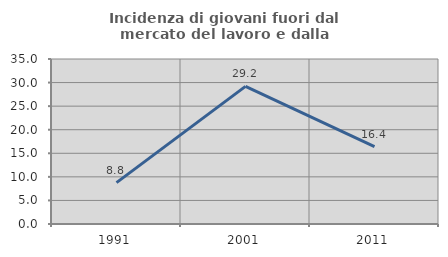
| Category | Incidenza di giovani fuori dal mercato del lavoro e dalla formazione  |
|---|---|
| 1991.0 | 8.777 |
| 2001.0 | 29.189 |
| 2011.0 | 16.418 |